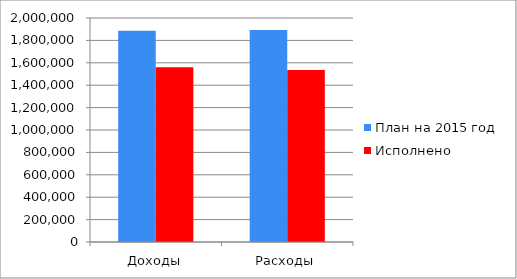
| Category | План на 2015 год | Исполнено  |
|---|---|---|
| Доходы | 1885395 | 1560339 |
| Расходы | 1893623 | 1536733 |